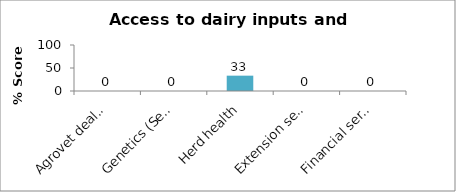
| Category | Series 0 |
|---|---|
| Agrovet dealer/Dairy feeds and feeding  | 0 |
| Genetics (Semen/certified seedlings/seed) | 0 |
| Herd health | 33.333 |
| Extension services | 0 |
| Financial services | 0 |